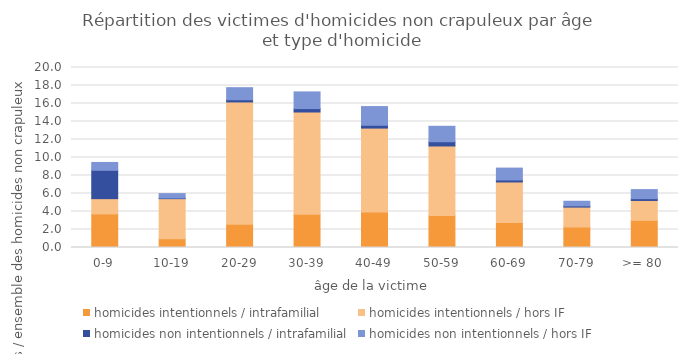
| Category | homicides intentionnels / intrafamilial | homicides intentionnels / hors IF | homicides non intentionnels / intrafamilial | homicides non intentionnels / hors IF |
|---|---|---|---|---|
| 0-9 | 3.73 | 1.698 | 3.149 | 0.871 |
| 10-19 | 0.96 | 4.467 | 0.067 | 0.491 |
| 20-29 | 2.591 | 13.581 | 0.246 | 1.34 |
| 30-39 | 3.708 | 11.347 | 0.38 | 1.854 |
| 40-49 | 3.954 | 9.314 | 0.313 | 2.077 |
| 50-59 | 3.551 | 7.728 | 0.469 | 1.72 |
| 60-69 | 2.77 | 4.512 | 0.223 | 1.318 |
| 70-79 | 2.278 | 2.211 | 0.134 | 0.514 |
| >= 80 | 3.015 | 2.211 | 0.201 | 1.005 |